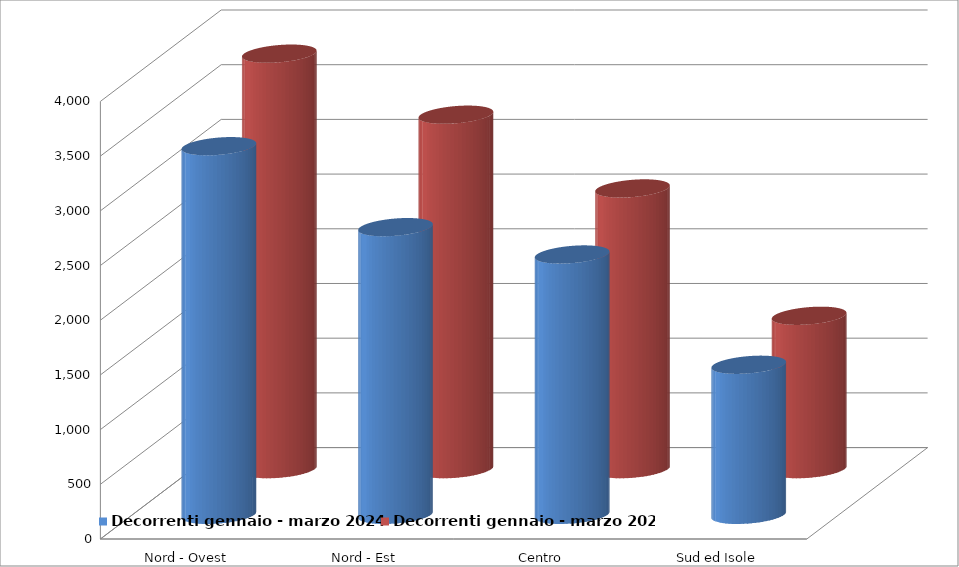
| Category | Decorrenti gennaio - marzo 2024 | Decorrenti gennaio - marzo 2023 |
|---|---|---|
| Nord - Ovest | 3370 | 3798 |
| Nord - Est | 2630 | 3240 |
| Centro | 2380 | 2566 |
| Sud ed Isole | 1372 | 1402 |